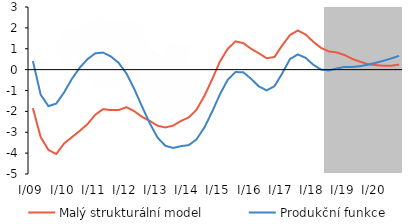
| Category | Malý strukturální model | Produkční funkce |
|---|---|---|
| I/09 | -1.849 | 0.409 |
| II | -3.236 | -1.201 |
| III | -3.851 | -1.749 |
| IV | -4.042 | -1.626 |
| I/10 | -3.54 | -1.094 |
| II | -3.238 | -0.446 |
| III | -2.939 | 0.087 |
| IV | -2.614 | 0.5 |
| I/11 | -2.161 | 0.782 |
| II | -1.894 | 0.817 |
| III | -1.938 | 0.634 |
| IV | -1.936 | 0.327 |
| I/12 | -1.802 | -0.181 |
| II | -1.989 | -0.919 |
| III | -2.259 | -1.761 |
| IV | -2.457 | -2.571 |
| I/13 | -2.687 | -3.257 |
| II | -2.771 | -3.648 |
| III | -2.68 | -3.752 |
| IV | -2.46 | -3.665 |
| I/14 | -2.29 | -3.619 |
| II | -1.923 | -3.341 |
| III | -1.266 | -2.779 |
| IV | -0.472 | -2.023 |
| I/15 | 0.383 | -1.187 |
| II | 0.994 | -0.488 |
| III | 1.353 | -0.115 |
| IV | 1.27 | -0.129 |
| I/16 | 0.999 | -0.437 |
| II | 0.785 | -0.805 |
| III | 0.545 | -0.995 |
| IV | 0.604 | -0.794 |
| I/17 | 1.16 | -0.182 |
| II | 1.662 | 0.507 |
| III | 1.874 | 0.727 |
| IV | 1.682 | 0.566 |
| I/18 | 1.33 | 0.229 |
| II | 1.037 | 0.001 |
| III | 0.871 | -0.039 |
| IV | 0.822 | 0.057 |
| I/19 | 0.697 | 0.127 |
| II | 0.511 | 0.128 |
| III | 0.377 | 0.166 |
| IV | 0.262 | 0.239 |
| I/20 | 0.217 | 0.327 |
| II | 0.186 | 0.425 |
| III | 0.187 | 0.536 |
| IV | 0.24 | 0.661 |